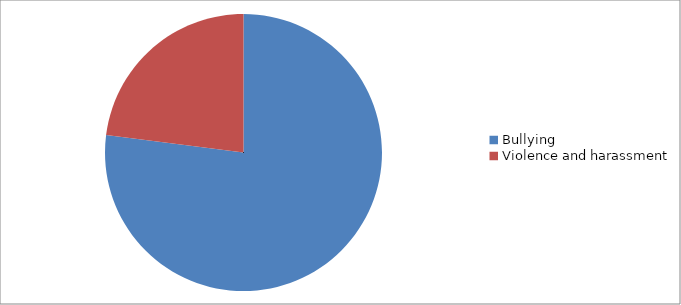
| Category | Series 0 |
|---|---|
| Bullying | 67 |
| Violence and harassment | 20 |